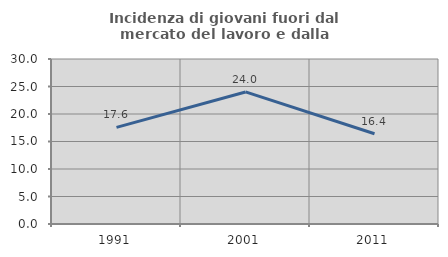
| Category | Incidenza di giovani fuori dal mercato del lavoro e dalla formazione  |
|---|---|
| 1991.0 | 17.559 |
| 2001.0 | 24.012 |
| 2011.0 | 16.418 |